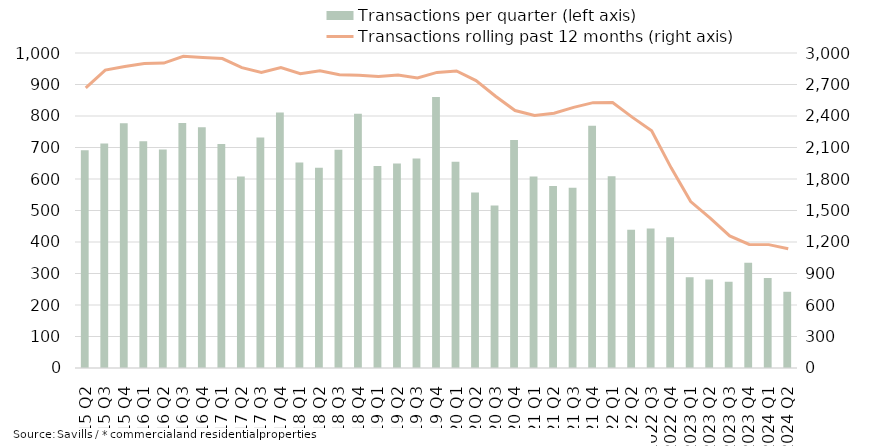
| Category | Transactions per quarter (left axis) |
|---|---|
| 2015 Q2 | 691 |
| 2015 Q3 | 713 |
| 2015 Q4 | 777 |
| 2016 Q1 | 720 |
| 2016 Q2 | 694 |
| 2016 Q3 | 778 |
| 2016 Q4 | 764 |
| 2017 Q1 | 711 |
| 2017 Q2 | 608 |
| 2017 Q3 | 732 |
| 2017 Q4 | 811 |
| 2018 Q1 | 652 |
| 2018 Q2 | 636 |
| 2018 Q3 | 693 |
| 2018 Q4 | 807 |
| 2019 Q1 | 641 |
| 2019 Q2 | 649 |
| 2019 Q3 | 665 |
| 2019 Q4 | 860 |
| 2020 Q1 | 655 |
| 2020 Q2 | 557 |
| 2020 Q3 | 516 |
| 2020 Q4 | 724 |
| 2021 Q1 | 608 |
| 2021 Q2 | 578 |
| 2021 Q3 | 572 |
| 2021 Q4 | 769 |
| 2022 Q1 | 609 |
| 2022 Q2 | 439 |
| 2022 Q3 | 443 |
| 2022 Q4 | 415 |
| 2023 Q1 | 288 |
| 2023 Q2 | 281 |
| 2023 Q3 | 274 |
| 2023 Q4 | 334 |
| 2024 Q1 | 286 |
| 2024 Q2 | 242 |